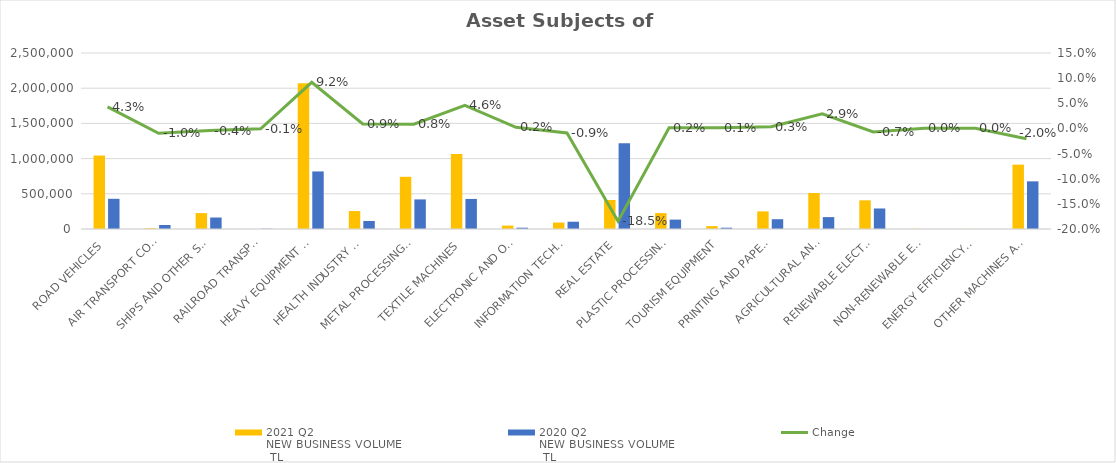
| Category | 2021 Q2 
NEW BUSINESS VOLUME
 TL | 2020 Q2 
NEW BUSINESS VOLUME
 TL |
|---|---|---|
| ROAD VEHICLES | 1043165.086 | 429007.295 |
| AIR TRANSPORT CONVEYANCE | 11001 | 57228.655 |
| SHIPS AND OTHER SEA-GOING VESSELS | 225904.444 | 163239.864 |
| RAILROAD TRANSPORT VEHICLES | 0 | 3781 |
| HEAVY EQUIPMENT AND CONSTRUCTION MACHINERY | 2071828.526 | 817643.076 |
| HEALTH INDUSTRY AND AESTHETIC INSTRUMENTS | 254809.379 | 113564.446 |
| METAL PROCESSING MACHINE | 741737.497 | 420297.022 |
| TEXTILE MACHINES | 1066761.487 | 427044.614 |
| ELECTRONIC AND OPTICAL DEVICES | 48094.247 | 18539.783 |
| INFORMATION TECHNOLOGIES AND OFFICE SYSTEMS | 91734.287 | 103409.485 |
| REAL ESTATE | 411670.224 | 1217360.5 |
| PLASTIC PROCESSING MACHINES | 225961.195 | 133325.922 |
| TOURISM EQUIPMENT | 41216.443 | 18162.958 |
| PRINTING AND PAPER PROCESSING MACHINES | 250322.133 | 139063.4 |
| AGRICULTURAL AND LIVESTOCK FARMING MACHINES | 511433.156 | 168962 |
| RENEWABLE ELECTRICITY GENERATION | 407364.193 | 291600.319 |
| NON-RENEWABLE ELECTRIC ENERGY GENERATION | 2857 | 0 |
| ENERGY EFFICIENCY EQUIPMENT | 1615.427 | 0 |
| OTHER MACHINES AND EQUIPMENT | 914299.381 | 676992.248 |